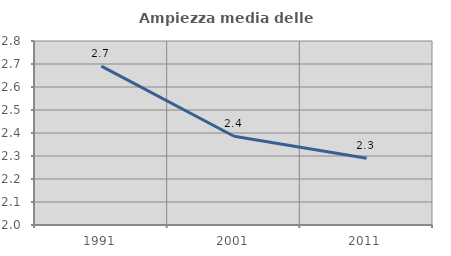
| Category | Ampiezza media delle famiglie |
|---|---|
| 1991.0 | 2.691 |
| 2001.0 | 2.386 |
| 2011.0 | 2.29 |